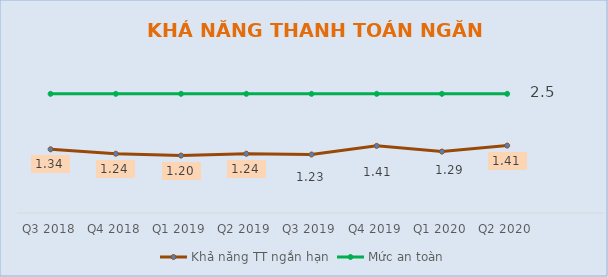
| Category | Khả năng TT ngắn hạn | Mức an toàn |
|---|---|---|
| Q3 2018 | 1.336 | 2.5 |
| Q4 2018 | 1.243 | 2.5 |
| Q1 2019 | 1.205 | 2.5 |
| Q2 2019 | 1.244 | 2.5 |
| Q3 2019 | 1.227 | 2.5 |
| Q4 2019 | 1.408 | 2.5 |
| Q1 2020 | 1.288 | 2.5 |
| Q2 2020 | 1.414 | 2.5 |